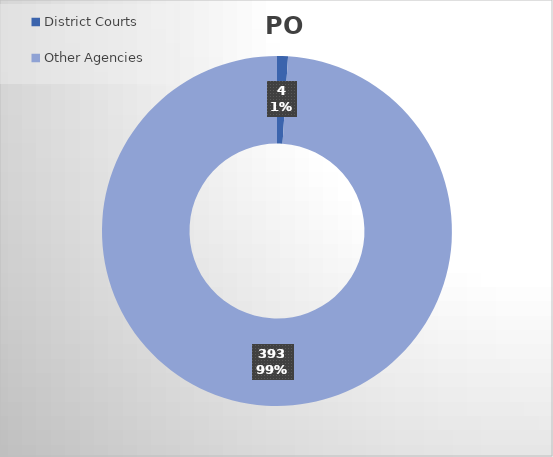
| Category | PO Lines |
|---|---|
| District Courts | 4 |
| Other Agencies | 393 |